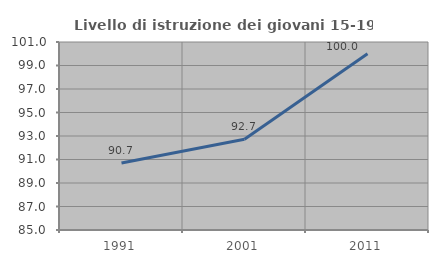
| Category | Livello di istruzione dei giovani 15-19 anni |
|---|---|
| 1991.0 | 90.698 |
| 2001.0 | 92.727 |
| 2011.0 | 100 |